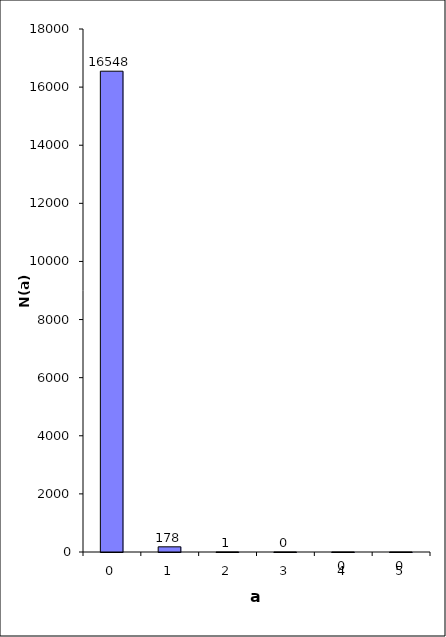
| Category | N(a) |
|---|---|
| 0.0 | 16547.965 |
| 1.0 | 178.073 |
| 2.0 | 0.958 |
| 3.0 | 0.003 |
| 4.0 | 0 |
| 5.0 | 0 |